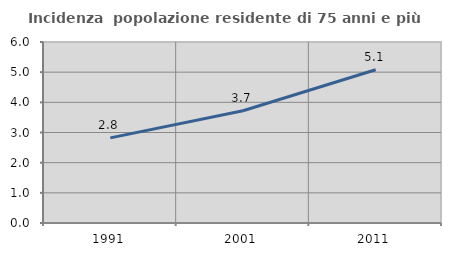
| Category | Incidenza  popolazione residente di 75 anni e più |
|---|---|
| 1991.0 | 2.823 |
| 2001.0 | 3.721 |
| 2011.0 | 5.081 |